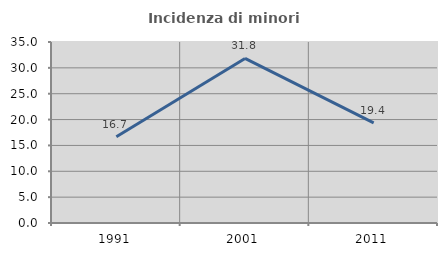
| Category | Incidenza di minori stranieri |
|---|---|
| 1991.0 | 16.667 |
| 2001.0 | 31.818 |
| 2011.0 | 19.355 |